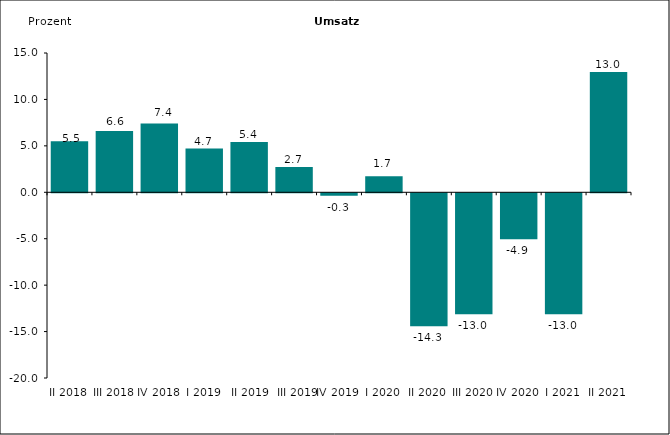
| Category | Series 0 |
|---|---|
| II 2018 | 5.5 |
| III 2018 | 6.6 |
| IV 2018 | 7.4 |
| I 2019 | 4.714 |
|  II 2019 | 5.422 |
|  III 2019 | 2.73 |
| IV 2019 | -0.265 |
| I 2020 | 1.721 |
| II 2020 | -14.324 |
| III 2020 | -13.033 |
| IV 2020 | -4.938 |
| I 2021 | -13.038 |
| II 2021 | 12.95 |